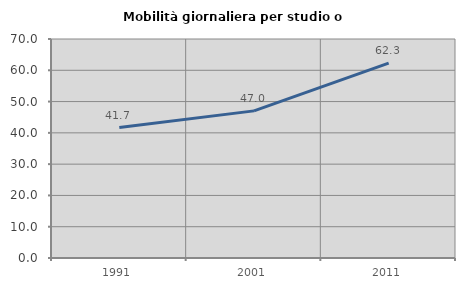
| Category | Mobilità giornaliera per studio o lavoro |
|---|---|
| 1991.0 | 41.69 |
| 2001.0 | 47.029 |
| 2011.0 | 62.309 |